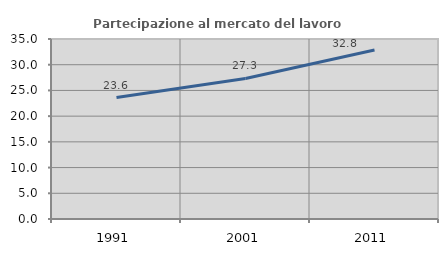
| Category | Partecipazione al mercato del lavoro  femminile |
|---|---|
| 1991.0 | 23.606 |
| 2001.0 | 27.326 |
| 2011.0 | 32.847 |